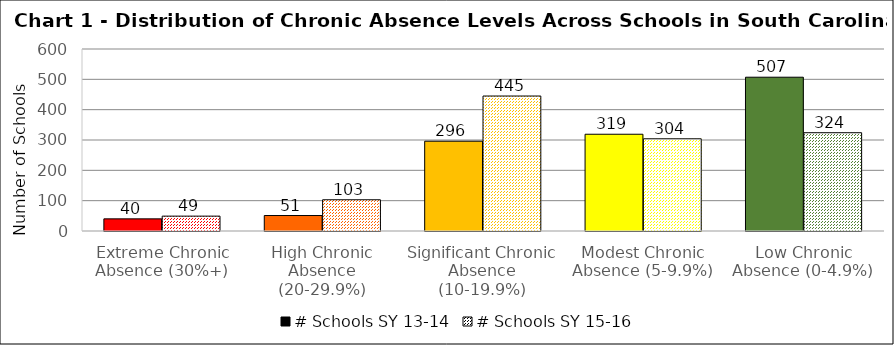
| Category | # Schools SY 13-14 | # Schools SY 15-16 |
|---|---|---|
| Extreme Chronic Absence (30%+) | 40 | 49 |
| High Chronic Absence (20-29.9%) | 51 | 103 |
| Significant Chronic Absence (10-19.9%) | 296 | 445 |
| Modest Chronic Absence (5-9.9%) | 319 | 304 |
| Low Chronic Absence (0-4.9%) | 507 | 324 |